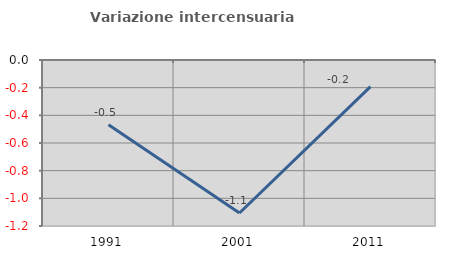
| Category | Variazione intercensuaria annua |
|---|---|
| 1991.0 | -0.468 |
| 2001.0 | -1.106 |
| 2011.0 | -0.192 |